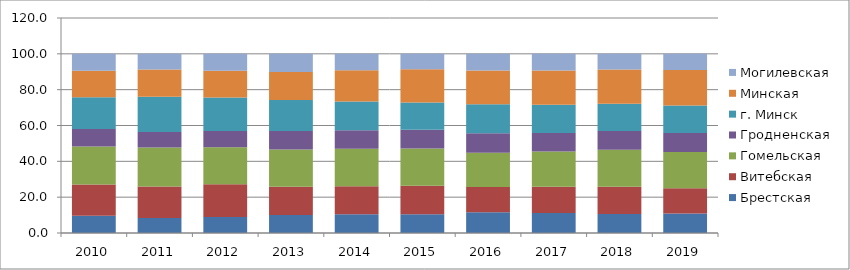
| Category | Брестская | Витебская | Гомельская | Гродненская | г. Минск | Минская | Могилевская |
|---|---|---|---|---|---|---|---|
| 0 | 9.6 | 17.5 | 21.2 | 9.7 | 17.8 | 14.7 | 9.5 |
| 1 | 8.4 | 17.5 | 21.8 | 8.7 | 19.6 | 15.2 | 8.8 |
| 2 | 9 | 18.2 | 20.6 | 9.2 | 18.6 | 14.9 | 9.5 |
| 3 | 10 | 15.8 | 20.8 | 10.3 | 17.3 | 15.7 | 10.1 |
| 4 | 10.4 | 15.7 | 20.9 | 10.4 | 16 | 17.5 | 9.1 |
| 5 | 10.5 | 15.9 | 20.8 | 10.4 | 15.3 | 18.5 | 8.6 |
| 6 | 11.6 | 14.1 | 19.1 | 10.9 | 16.1 | 18.9 | 9.3 |
| 7 | 11.2 | 14.6 | 19.7 | 10.3 | 15.8 | 19.1 | 9.3 |
| 8 | 10.6 | 15.2 | 20.6 | 10.5 | 15.3 | 19.1 | 8.7 |
| 9 | 10.9 | 14.1 | 20.2 | 10.6 | 15.3 | 19.9 | 9 |